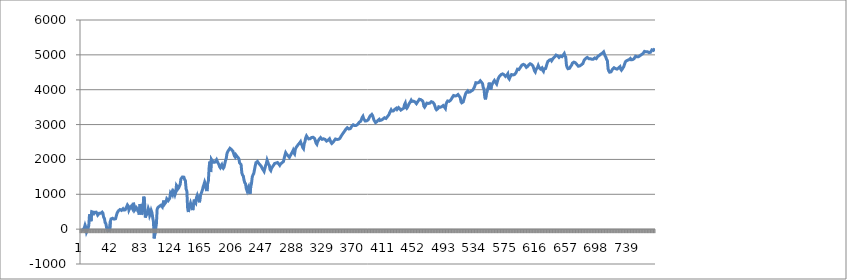
| Category | Series 0 |
|---|---|
| 0 | -35 |
| 1 | -50 |
| 2 | -22.665 |
| 3 | -7.665 |
| 4 | 37.335 |
| 5 | 115.035 |
| 6 | 55.035 |
| 7 | -84.965 |
| 8 | -60.965 |
| 9 | 11.275 |
| 10 | 113.275 |
| 11 | 426.715 |
| 12 | 366.715 |
| 13 | 226.715 |
| 14 | 500.795 |
| 15 | 500.795 |
| 16 | 485.795 |
| 17 | 450.795 |
| 18 | 482.61 |
| 19 | 502.11 |
| 20 | 487.11 |
| 21 | 452.11 |
| 22 | 402.11 |
| 23 | 421.61 |
| 24 | 454.93 |
| 25 | 454.93 |
| 26 | 454.93 |
| 27 | 475.51 |
| 28 | 487.51 |
| 29 | 457.51 |
| 30 | 337.51 |
| 31 | 307.51 |
| 32 | 187.51 |
| 33 | 157.51 |
| 34 | 37.51 |
| 35 | -12.49 |
| 36 | -72.49 |
| 37 | 64.55 |
| 38 | -55.45 |
| 39 | 218.63 |
| 40 | 293.63 |
| 41 | 293.63 |
| 42 | 312.04 |
| 43 | 322.54 |
| 44 | 287.54 |
| 45 | 272.54 |
| 46 | 298.04 |
| 47 | 376.88 |
| 48 | 453.78 |
| 49 | 497.23 |
| 50 | 526.385 |
| 51 | 541.385 |
| 52 | 561.965 |
| 53 | 573.215 |
| 54 | 538.215 |
| 55 | 523.215 |
| 56 | 583.215 |
| 57 | 548.215 |
| 58 | 533.215 |
| 59 | 552.715 |
| 60 | 604.795 |
| 61 | 644.795 |
| 62 | 694.795 |
| 63 | 664.795 |
| 64 | 544.795 |
| 65 | 592.795 |
| 66 | 609.295 |
| 67 | 652.695 |
| 68 | 676.695 |
| 69 | 576.695 |
| 70 | 756.695 |
| 71 | 656.695 |
| 72 | 556.695 |
| 73 | 578.295 |
| 74 | 618.965 |
| 75 | 588.965 |
| 76 | 518.965 |
| 77 | 488.965 |
| 78 | 418.965 |
| 79 | 718.965 |
| 80 | 658.965 |
| 81 | 418.965 |
| 82 | 466.965 |
| 83 | 632.325 |
| 84 | 932.325 |
| 85 | 812.325 |
| 86 | 332.325 |
| 87 | 332.325 |
| 88 | 451.885 |
| 89 | 505.885 |
| 90 | 593.385 |
| 91 | 533.385 |
| 92 | 393.385 |
| 93 | 447.385 |
| 94 | 534.885 |
| 95 | 474.885 |
| 96 | 334.885 |
| 97 | 214.885 |
| 98 | -265.115 |
| 99 | -265.115 |
| 100 | 10.405 |
| 101 | 154.405 |
| 102 | 571.045 |
| 103 | 621.045 |
| 104 | 637.245 |
| 105 | 654.745 |
| 106 | 669.745 |
| 107 | 685.635 |
| 108 | 670.635 |
| 109 | 635.635 |
| 110 | 656.635 |
| 111 | 819.835 |
| 112 | 719.835 |
| 113 | 748.395 |
| 114 | 780.175 |
| 115 | 871.075 |
| 116 | 856.075 |
| 117 | 821.075 |
| 118 | 848.075 |
| 119 | 888.045 |
| 120 | 1038.045 |
| 121 | 1008.045 |
| 122 | 1062.525 |
| 123 | 1002.525 |
| 124 | 1086.525 |
| 125 | 1056.525 |
| 126 | 986.525 |
| 127 | 1052.525 |
| 128 | 1256.525 |
| 129 | 1226.525 |
| 130 | 1156.525 |
| 131 | 1186.525 |
| 132 | 1236.225 |
| 133 | 1287.225 |
| 134 | 1440.825 |
| 135 | 1461.825 |
| 136 | 1496.825 |
| 137 | 1521.325 |
| 138 | 1491.325 |
| 139 | 1421.325 |
| 140 | 1391.325 |
| 141 | 1151.325 |
| 142 | 1091.325 |
| 143 | 611.325 |
| 144 | 491.325 |
| 145 | 599.125 |
| 146 | 665.125 |
| 147 | 746.325 |
| 148 | 746.325 |
| 149 | 606.325 |
| 150 | 546.325 |
| 151 | 738.325 |
| 152 | 849.325 |
| 153 | 779.325 |
| 154 | 749.325 |
| 155 | 910.125 |
| 156 | 970.125 |
| 157 | 900.125 |
| 158 | 870.125 |
| 159 | 770.125 |
| 160 | 954.685 |
| 161 | 954.685 |
| 162 | 1064.025 |
| 163 | 1130.025 |
| 164 | 1220.885 |
| 165 | 1280.885 |
| 166 | 1352.285 |
| 167 | 1292.285 |
| 168 | 1152.285 |
| 169 | 1092.285 |
| 170 | 1308.285 |
| 171 | 1392.285 |
| 172 | 1779.165 |
| 173 | 1937.565 |
| 174 | 1637.565 |
| 175 | 2003.565 |
| 176 | 1968.565 |
| 177 | 1953.565 |
| 178 | 1918.565 |
| 179 | 1903.565 |
| 180 | 1922.885 |
| 181 | 1937.885 |
| 182 | 1992.485 |
| 183 | 2011.985 |
| 184 | 1891.985 |
| 185 | 1861.985 |
| 186 | 1791.985 |
| 187 | 1761.985 |
| 188 | 1810.285 |
| 189 | 1846.285 |
| 190 | 1776.285 |
| 191 | 1746.285 |
| 192 | 1777.785 |
| 193 | 1798.035 |
| 194 | 1966.035 |
| 195 | 2026.035 |
| 196 | 2170.035 |
| 197 | 2221.035 |
| 198 | 2257.435 |
| 199 | 2279.935 |
| 200 | 2319.905 |
| 201 | 2319.905 |
| 202 | 2284.905 |
| 203 | 2269.905 |
| 204 | 2234.905 |
| 205 | 2219.905 |
| 206 | 2099.905 |
| 207 | 2069.905 |
| 208 | 2131.105 |
| 209 | 2101.105 |
| 210 | 2086.105 |
| 211 | 2051.105 |
| 212 | 2021.105 |
| 213 | 1901.105 |
| 214 | 1886.105 |
| 215 | 1851.105 |
| 216 | 1611.105 |
| 217 | 1551.105 |
| 218 | 1521.105 |
| 219 | 1401.105 |
| 220 | 1331.105 |
| 221 | 1301.105 |
| 222 | 1161.105 |
| 223 | 1101.105 |
| 224 | 1171.105 |
| 225 | 1214.905 |
| 226 | 1074.905 |
| 227 | 1014.905 |
| 228 | 1228.025 |
| 229 | 1306.025 |
| 230 | 1494.905 |
| 231 | 1557.905 |
| 232 | 1593.745 |
| 233 | 1616.245 |
| 234 | 1810.645 |
| 235 | 1906.645 |
| 236 | 1918.645 |
| 237 | 1941.675 |
| 238 | 1906.675 |
| 239 | 1891.675 |
| 240 | 1856.675 |
| 241 | 1841.675 |
| 242 | 1806.675 |
| 243 | 1791.675 |
| 244 | 1721.675 |
| 245 | 1691.675 |
| 246 | 1656.675 |
| 247 | 1641.675 |
| 248 | 1822.155 |
| 249 | 1882.155 |
| 250 | 1980.555 |
| 251 | 1980.555 |
| 252 | 1860.555 |
| 253 | 1830.555 |
| 254 | 1710.555 |
| 255 | 1680.555 |
| 256 | 1745.355 |
| 257 | 1767.855 |
| 258 | 1811.255 |
| 259 | 1841.255 |
| 260 | 1881.015 |
| 261 | 1881.015 |
| 262 | 1897.08 |
| 263 | 1882.08 |
| 264 | 1911.48 |
| 265 | 1930.98 |
| 266 | 1860.98 |
| 267 | 1830.98 |
| 268 | 1868.64 |
| 269 | 1868.64 |
| 270 | 1901.365 |
| 271 | 1920.865 |
| 272 | 1939.975 |
| 273 | 1956.475 |
| 274 | 2122.075 |
| 275 | 2194.075 |
| 276 | 2159.075 |
| 277 | 2144.075 |
| 278 | 2109.075 |
| 279 | 2094.075 |
| 280 | 2059.075 |
| 281 | 2044.075 |
| 282 | 2138.515 |
| 283 | 2138.515 |
| 284 | 2214.255 |
| 285 | 2259.255 |
| 286 | 2189.255 |
| 287 | 2159.255 |
| 288 | 2291.015 |
| 289 | 2339.015 |
| 290 | 2370.515 |
| 291 | 2390.015 |
| 292 | 2429.775 |
| 293 | 2429.775 |
| 294 | 2479.475 |
| 295 | 2509.475 |
| 296 | 2439.475 |
| 297 | 2409.475 |
| 298 | 2339.475 |
| 299 | 2309.475 |
| 300 | 2454.915 |
| 301 | 2508.915 |
| 302 | 2626.035 |
| 303 | 2674.035 |
| 304 | 2639.035 |
| 305 | 2624.035 |
| 306 | 2589.035 |
| 307 | 2574.035 |
| 308 | 2595.035 |
| 309 | 2614.835 |
| 310 | 2630.585 |
| 311 | 2615.585 |
| 312 | 2634.835 |
| 313 | 2634.835 |
| 314 | 2599.835 |
| 315 | 2584.835 |
| 316 | 2464.835 |
| 317 | 2434.835 |
| 318 | 2507.555 |
| 319 | 2507.555 |
| 320 | 2578.115 |
| 321 | 2606.675 |
| 322 | 2626.66 |
| 323 | 2611.66 |
| 324 | 2576.66 |
| 325 | 2561.66 |
| 326 | 2591.305 |
| 327 | 2610.805 |
| 328 | 2575.805 |
| 329 | 2560.805 |
| 330 | 2525.805 |
| 331 | 2510.805 |
| 332 | 2549.935 |
| 333 | 2575.435 |
| 334 | 2594.37 |
| 335 | 2608.26 |
| 336 | 2488.26 |
| 337 | 2458.26 |
| 338 | 2481.29 |
| 339 | 2497.79 |
| 340 | 2530.515 |
| 341 | 2553.015 |
| 342 | 2586.335 |
| 343 | 2608.835 |
| 344 | 2573.835 |
| 345 | 2558.835 |
| 346 | 2576.335 |
| 347 | 2561.335 |
| 348 | 2603.335 |
| 349 | 2627.335 |
| 350 | 2679.835 |
| 351 | 2711.335 |
| 352 | 2742.835 |
| 353 | 2762.335 |
| 354 | 2804.335 |
| 355 | 2834.335 |
| 356 | 2865.835 |
| 357 | 2888.335 |
| 358 | 2907.9 |
| 359 | 2907.9 |
| 360 | 2872.9 |
| 361 | 2857.9 |
| 362 | 2883.8 |
| 363 | 2898.05 |
| 364 | 2950.85 |
| 365 | 2971.85 |
| 366 | 2994.005 |
| 367 | 3006.305 |
| 368 | 2971.305 |
| 369 | 2956.305 |
| 370 | 2976.605 |
| 371 | 2988.605 |
| 372 | 3007.505 |
| 373 | 3021.305 |
| 374 | 3066.805 |
| 375 | 3066.805 |
| 376 | 3096.805 |
| 377 | 3144.805 |
| 378 | 3205.705 |
| 379 | 3237.205 |
| 380 | 3167.205 |
| 381 | 3137.205 |
| 382 | 3102.205 |
| 383 | 3087.205 |
| 384 | 3106.455 |
| 385 | 3106.455 |
| 386 | 3134.805 |
| 387 | 3134.805 |
| 388 | 3223.605 |
| 389 | 3253.605 |
| 390 | 3278.07 |
| 391 | 3291.57 |
| 392 | 3256.57 |
| 393 | 3241.57 |
| 394 | 3121.57 |
| 395 | 3091.57 |
| 396 | 3056.57 |
| 397 | 3041.57 |
| 398 | 3087 |
| 399 | 3117 |
| 400 | 3138.07 |
| 401 | 3152.32 |
| 402 | 3117.32 |
| 403 | 3102.32 |
| 404 | 3129.235 |
| 405 | 3144.985 |
| 406 | 3159.16 |
| 407 | 3168.16 |
| 408 | 3194.69 |
| 409 | 3209.69 |
| 410 | 3174.69 |
| 411 | 3159.69 |
| 412 | 3228.69 |
| 413 | 3255.69 |
| 414 | 3283.98 |
| 415 | 3337.98 |
| 416 | 3361.98 |
| 417 | 3421.98 |
| 418 | 3386.98 |
| 419 | 3371.98 |
| 420 | 3392.105 |
| 421 | 3403.355 |
| 422 | 3440.355 |
| 423 | 3457.96 |
| 424 | 3469.96 |
| 425 | 3434.96 |
| 426 | 3419.96 |
| 427 | 3486.68 |
| 428 | 3515.18 |
| 429 | 3445.18 |
| 430 | 3415.18 |
| 431 | 3433.135 |
| 432 | 3444.385 |
| 433 | 3459.925 |
| 434 | 3471.925 |
| 435 | 3576.325 |
| 436 | 3618.325 |
| 437 | 3498.325 |
| 438 | 3468.325 |
| 439 | 3499.3 |
| 440 | 3516.55 |
| 441 | 3592.29 |
| 442 | 3592.29 |
| 443 | 3657.67 |
| 444 | 3699.67 |
| 445 | 3664.67 |
| 446 | 3649.67 |
| 447 | 3672.245 |
| 448 | 3684.995 |
| 449 | 3649.995 |
| 450 | 3634.995 |
| 451 | 3599.995 |
| 452 | 3584.995 |
| 453 | 3663.675 |
| 454 | 3663.675 |
| 455 | 3727.155 |
| 456 | 3749.655 |
| 457 | 3714.655 |
| 458 | 3699.655 |
| 459 | 3684.655 |
| 460 | 3649.655 |
| 461 | 3529.655 |
| 462 | 3499.655 |
| 463 | 3534.165 |
| 464 | 3534.165 |
| 465 | 3615.765 |
| 466 | 3641.265 |
| 467 | 3606.265 |
| 468 | 3591.265 |
| 469 | 3613.315 |
| 470 | 3625.315 |
| 471 | 3657.515 |
| 472 | 3675.515 |
| 473 | 3640.515 |
| 474 | 3625.515 |
| 475 | 3590.515 |
| 476 | 3575.515 |
| 477 | 3455.515 |
| 478 | 3425.515 |
| 479 | 3447.565 |
| 480 | 3459.565 |
| 481 | 3509.605 |
| 482 | 3530.605 |
| 483 | 3495.605 |
| 484 | 3480.605 |
| 485 | 3512.105 |
| 486 | 3530.105 |
| 487 | 3545.555 |
| 488 | 3562.005 |
| 489 | 3492.005 |
| 490 | 3462.005 |
| 491 | 3594.005 |
| 492 | 3642.005 |
| 493 | 3677.005 |
| 494 | 3701.005 |
| 495 | 3666.005 |
| 496 | 3651.005 |
| 497 | 3698.605 |
| 498 | 3731.605 |
| 499 | 3768.425 |
| 500 | 3793.025 |
| 501 | 3833.485 |
| 502 | 3855.085 |
| 503 | 3820.085 |
| 504 | 3805.085 |
| 505 | 3828.255 |
| 506 | 3841.005 |
| 507 | 3862.6 |
| 508 | 3873.55 |
| 509 | 3803.55 |
| 510 | 3773.55 |
| 511 | 3653.55 |
| 512 | 3623.55 |
| 513 | 3642.17 |
| 514 | 3651.62 |
| 515 | 3724.82 |
| 516 | 3751.82 |
| 517 | 3871.82 |
| 518 | 3919.82 |
| 519 | 3947.82 |
| 520 | 3964.32 |
| 521 | 3929.32 |
| 522 | 3914.32 |
| 523 | 3935.32 |
| 524 | 3949.57 |
| 525 | 3965.67 |
| 526 | 3976.17 |
| 527 | 3991.92 |
| 528 | 4006.62 |
| 529 | 4070.22 |
| 530 | 4091.22 |
| 531 | 4201.22 |
| 532 | 4228.72 |
| 533 | 4193.72 |
| 534 | 4178.72 |
| 535 | 4209.52 |
| 536 | 4226.02 |
| 537 | 4256.82 |
| 538 | 4273.32 |
| 539 | 4203.32 |
| 540 | 4173.32 |
| 541 | 4053.32 |
| 542 | 4023.32 |
| 543 | 3783.32 |
| 544 | 3723.32 |
| 545 | 3884.12 |
| 546 | 3929.12 |
| 547 | 4029.92 |
| 548 | 4083.92 |
| 549 | 4202.92 |
| 550 | 4202.92 |
| 551 | 4002.92 |
| 552 | 4103.72 |
| 553 | 4157.72 |
| 554 | 4199.72 |
| 555 | 4199.72 |
| 556 | 4264.12 |
| 557 | 4264.12 |
| 558 | 4194.12 |
| 559 | 4164.12 |
| 560 | 4164.12 |
| 561 | 4312.92 |
| 562 | 4357.92 |
| 563 | 4388.37 |
| 564 | 4404.12 |
| 565 | 4434.92 |
| 566 | 4434.92 |
| 567 | 4454.52 |
| 568 | 4464.27 |
| 569 | 4429.27 |
| 570 | 4414.27 |
| 571 | 4379.27 |
| 572 | 4364.27 |
| 573 | 4425.17 |
| 574 | 4456.67 |
| 575 | 4336.67 |
| 576 | 4306.67 |
| 577 | 4359.73 |
| 578 | 4388.23 |
| 579 | 4434.92 |
| 580 | 4458.92 |
| 581 | 4423.92 |
| 582 | 4408.92 |
| 583 | 4433.56 |
| 584 | 4446.61 |
| 585 | 4485.04 |
| 586 | 4504.54 |
| 587 | 4588.42 |
| 588 | 4613.92 |
| 589 | 4578.92 |
| 590 | 4563.92 |
| 591 | 4643.36 |
| 592 | 4668.86 |
| 593 | 4706.73 |
| 594 | 4706.73 |
| 595 | 4727.73 |
| 596 | 4741.23 |
| 597 | 4706.23 |
| 598 | 4691.23 |
| 599 | 4641.23 |
| 600 | 4663.245 |
| 601 | 4674.495 |
| 602 | 4708.655 |
| 603 | 4728.755 |
| 604 | 4744.68 |
| 605 | 4759.38 |
| 606 | 4724.38 |
| 607 | 4709.38 |
| 608 | 4674.38 |
| 609 | 4659.38 |
| 610 | 4539.38 |
| 611 | 4509.38 |
| 612 | 4581.38 |
| 613 | 4581.38 |
| 614 | 4636.38 |
| 615 | 4693.38 |
| 616 | 4643.38 |
| 617 | 4628.38 |
| 618 | 4593.38 |
| 619 | 4609.13 |
| 620 | 4626.63 |
| 621 | 4556.63 |
| 622 | 4526.63 |
| 623 | 4599.35 |
| 624 | 4599.35 |
| 625 | 4610.6 |
| 626 | 4632.475 |
| 627 | 4758.235 |
| 628 | 4811.035 |
| 629 | 4836.97 |
| 630 | 4850.47 |
| 631 | 4865.52 |
| 632 | 4865.52 |
| 633 | 4830.52 |
| 634 | 4815.52 |
| 635 | 4895.56 |
| 636 | 4895.56 |
| 637 | 4938.96 |
| 638 | 4965.96 |
| 639 | 4993.96 |
| 640 | 5010.46 |
| 641 | 4975.46 |
| 642 | 4960.46 |
| 643 | 4925.46 |
| 644 | 4910.46 |
| 645 | 4965.06 |
| 646 | 4982.46 |
| 647 | 4947.46 |
| 648 | 4932.46 |
| 649 | 5007.46 |
| 650 | 5037.46 |
| 651 | 4967.46 |
| 652 | 4937.46 |
| 653 | 4697.46 |
| 654 | 4637.46 |
| 655 | 4602.46 |
| 656 | 4587.46 |
| 657 | 4612.45 |
| 658 | 4625.95 |
| 659 | 4679.78 |
| 660 | 4709.78 |
| 661 | 4763.06 |
| 662 | 4763.06 |
| 663 | 4791.76 |
| 664 | 4808.26 |
| 665 | 4773.26 |
| 666 | 4758.26 |
| 667 | 4723.26 |
| 668 | 4708.26 |
| 669 | 4673.26 |
| 670 | 4658.26 |
| 671 | 4684.195 |
| 672 | 4698.745 |
| 673 | 4714.495 |
| 674 | 4724.245 |
| 675 | 4748.745 |
| 676 | 4766.745 |
| 677 | 4856.985 |
| 678 | 4885.485 |
| 679 | 4900.43 |
| 680 | 4910.93 |
| 681 | 4926.155 |
| 682 | 4926.155 |
| 683 | 4891.155 |
| 684 | 4876.155 |
| 685 | 4891.455 |
| 686 | 4909.41 |
| 687 | 4874.41 |
| 688 | 4859.41 |
| 689 | 4876.07 |
| 690 | 4885.82 |
| 691 | 4911.195 |
| 692 | 4924.395 |
| 693 | 4889.395 |
| 694 | 4874.395 |
| 695 | 4950.835 |
| 696 | 4950.835 |
| 697 | 4981.53 |
| 698 | 4997.28 |
| 699 | 5017.16 |
| 700 | 5029.16 |
| 701 | 5044.91 |
| 702 | 5055.41 |
| 703 | 5087.61 |
| 704 | 5087.61 |
| 705 | 4967.61 |
| 706 | 4937.61 |
| 707 | 4867.61 |
| 708 | 4837.61 |
| 709 | 4597.61 |
| 710 | 4537.61 |
| 711 | 4502.61 |
| 712 | 4487.61 |
| 713 | 4513.16 |
| 714 | 4525.61 |
| 715 | 4590.53 |
| 716 | 4610.03 |
| 717 | 4630.155 |
| 718 | 4640.655 |
| 719 | 4605.655 |
| 720 | 4590.655 |
| 721 | 4590.655 |
| 722 | 4612.53 |
| 723 | 4623.33 |
| 724 | 4647.83 |
| 725 | 4660.58 |
| 726 | 4590.58 |
| 727 | 4560.58 |
| 728 | 4591.66 |
| 729 | 4591.66 |
| 730 | 4659.1 |
| 731 | 4680.1 |
| 732 | 4787.14 |
| 733 | 4818.34 |
| 734 | 4843.33 |
| 735 | 4843.33 |
| 736 | 4859.99 |
| 737 | 4859.99 |
| 738 | 4880.99 |
| 739 | 4894.79 |
| 740 | 4859.79 |
| 741 | 4844.79 |
| 742 | 4863.69 |
| 743 | 4873.44 |
| 744 | 4890.1 |
| 745 | 4899.475 |
| 746 | 4961.035 |
| 747 | 4979.425 |
| 748 | 4944.425 |
| 749 | 4929.425 |
| 750 | 4947.555 |
| 751 | 4957.305 |
| 752 | 4978.305 |
| 753 | 4993.305 |
| 754 | 5009.055 |
| 755 | 5017.605 |
| 756 | 5036.12 |
| 757 | 5036.12 |
| 758 | 5099.24 |
| 759 | 5120.99 |
| 760 | 5085.99 |
| 761 | 5070.99 |
| 762 | 5089.925 |
| 763 | 5099.675 |
| 764 | 5064.675 |
| 765 | 5049.675 |
| 766 | 5072.11 |
| 767 | 5085.16 |
| 768 | 5145.16 |
| 769 | 5163.16 |
| 770 | 5128.16 |
| 771 | 5113.16 |
| 772 | 5182.88 |
| 773 | 5205.38 |